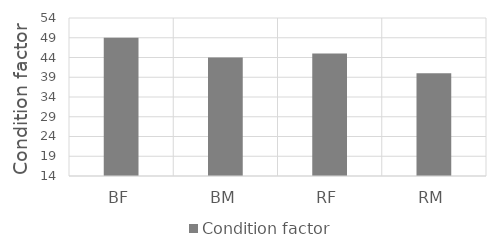
| Category | Condition factor |
|---|---|
| BF | 49 |
| BM | 44 |
| RF | 45 |
| RM | 40 |